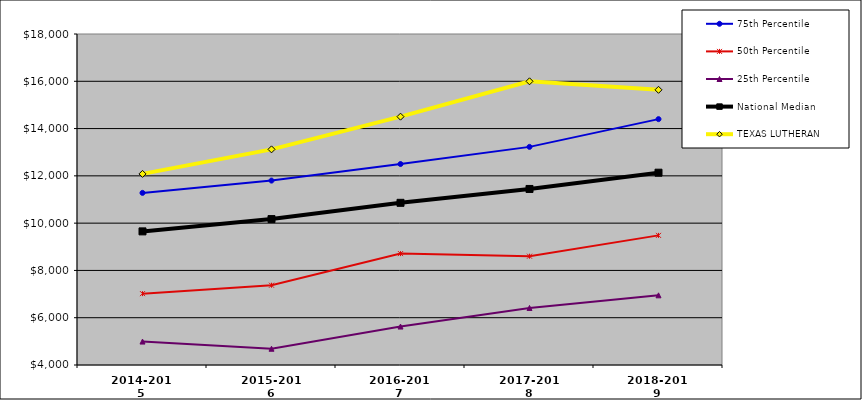
| Category | 75th Percentile | 50th Percentile | 25th Percentile | National Median | TEXAS LUTHERAN |
|---|---|---|---|---|---|
| 2014-2015 | 11279.628 | 7018.372 | 4990.813 | 9651.331 | 12082.598 |
| 2015-2016 | 11800.161 | 7373.941 | 4687.631 | 10170.953 | 13120.524 |
| 2016-2017 | 12500.037 | 8710.76 | 5625.768 | 10859.41 | 14503.602 |
| 2017-2018 | 13226.02 | 8601.864 | 6413.429 | 11445.61 | 15999.237 |
| 2018-2019 | 14399.581 | 9482.813 | 6947.318 | 12133.725 | 15639.308 |